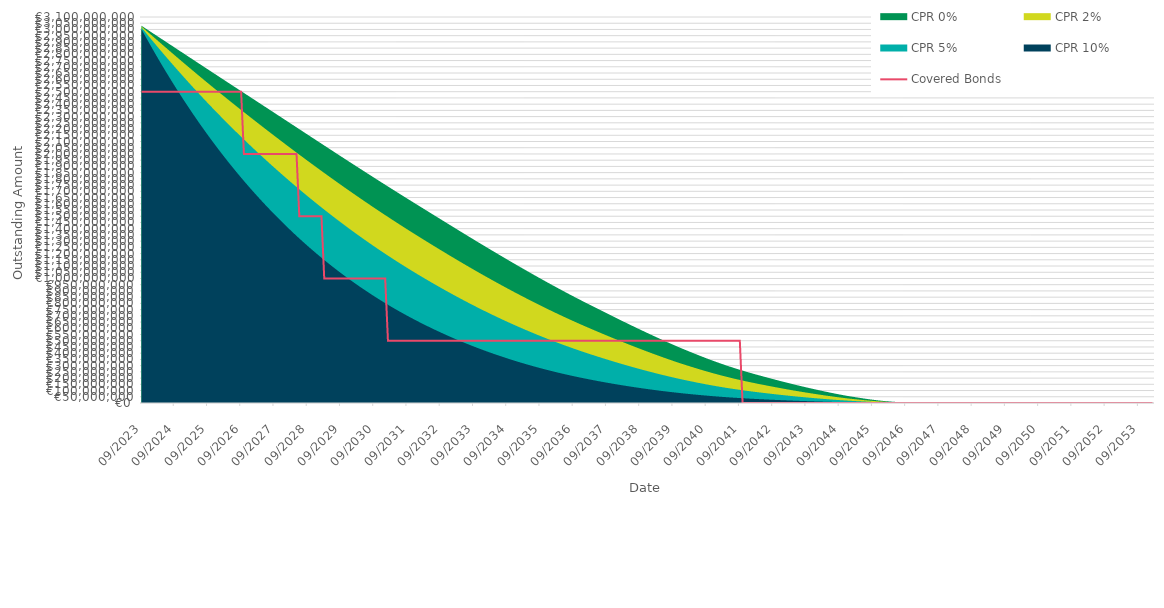
| Category | Covered Bonds |
|---|---|
| 2023-09-30 | 2500000000 |
| 2023-10-31 | 2500000000 |
| 2023-11-30 | 2500000000 |
| 2023-12-31 | 2500000000 |
| 2024-01-31 | 2500000000 |
| 2024-02-29 | 2500000000 |
| 2024-03-31 | 2500000000 |
| 2024-04-30 | 2500000000 |
| 2024-05-31 | 2500000000 |
| 2024-06-30 | 2500000000 |
| 2024-07-31 | 2500000000 |
| 2024-08-31 | 2500000000 |
| 2024-09-30 | 2500000000 |
| 2024-10-31 | 2500000000 |
| 2024-11-30 | 2500000000 |
| 2024-12-31 | 2500000000 |
| 2025-01-31 | 2500000000 |
| 2025-02-28 | 2500000000 |
| 2025-03-31 | 2500000000 |
| 2025-04-30 | 2500000000 |
| 2025-05-31 | 2500000000 |
| 2025-06-30 | 2500000000 |
| 2025-07-31 | 2500000000 |
| 2025-08-31 | 2500000000 |
| 2025-09-30 | 2500000000 |
| 2025-10-31 | 2500000000 |
| 2025-11-30 | 2500000000 |
| 2025-12-31 | 2500000000 |
| 2026-01-31 | 2500000000 |
| 2026-02-28 | 2500000000 |
| 2026-03-31 | 2500000000 |
| 2026-04-30 | 2500000000 |
| 2026-05-31 | 2500000000 |
| 2026-06-30 | 2500000000 |
| 2026-07-31 | 2500000000 |
| 2026-08-31 | 2500000000 |
| 2026-09-30 | 2500000000 |
| 2026-10-31 | 2000000000 |
| 2026-11-30 | 2000000000 |
| 2026-12-31 | 2000000000 |
| 2027-01-31 | 2000000000 |
| 2027-02-28 | 2000000000 |
| 2027-03-31 | 2000000000 |
| 2027-04-30 | 2000000000 |
| 2027-05-31 | 2000000000 |
| 2027-06-30 | 2000000000 |
| 2027-07-31 | 2000000000 |
| 2027-08-31 | 2000000000 |
| 2027-09-30 | 2000000000 |
| 2027-10-31 | 2000000000 |
| 2027-11-30 | 2000000000 |
| 2027-12-31 | 2000000000 |
| 2028-01-31 | 2000000000 |
| 2028-02-29 | 2000000000 |
| 2028-03-31 | 2000000000 |
| 2028-04-30 | 2000000000 |
| 2028-05-31 | 2000000000 |
| 2028-06-30 | 1500000000 |
| 2028-07-31 | 1500000000 |
| 2028-08-31 | 1500000000 |
| 2028-09-30 | 1500000000 |
| 2028-10-31 | 1500000000 |
| 2028-11-30 | 1500000000 |
| 2028-12-31 | 1500000000 |
| 2029-01-31 | 1500000000 |
| 2029-02-28 | 1500000000 |
| 2029-03-31 | 1000000000 |
| 2029-04-30 | 1000000000 |
| 2029-05-31 | 1000000000 |
| 2029-06-30 | 1000000000 |
| 2029-07-31 | 1000000000 |
| 2029-08-31 | 1000000000 |
| 2029-09-30 | 1000000000 |
| 2029-10-31 | 1000000000 |
| 2029-11-30 | 1000000000 |
| 2029-12-31 | 1000000000 |
| 2030-01-31 | 1000000000 |
| 2030-02-28 | 1000000000 |
| 2030-03-31 | 1000000000 |
| 2030-04-30 | 1000000000 |
| 2030-05-31 | 1000000000 |
| 2030-06-30 | 1000000000 |
| 2030-07-31 | 1000000000 |
| 2030-08-31 | 1000000000 |
| 2030-09-30 | 1000000000 |
| 2030-10-31 | 1000000000 |
| 2030-11-30 | 1000000000 |
| 2030-12-31 | 1000000000 |
| 2031-01-31 | 1000000000 |
| 2031-02-28 | 500000000 |
| 2031-03-31 | 500000000 |
| 2031-04-30 | 500000000 |
| 2031-05-31 | 500000000 |
| 2031-06-30 | 500000000 |
| 2031-07-31 | 500000000 |
| 2031-08-31 | 500000000 |
| 2031-09-30 | 500000000 |
| 2031-10-31 | 500000000 |
| 2031-11-30 | 500000000 |
| 2031-12-31 | 500000000 |
| 2032-01-31 | 500000000 |
| 2032-02-29 | 500000000 |
| 2032-03-31 | 500000000 |
| 2032-04-30 | 500000000 |
| 2032-05-31 | 500000000 |
| 2032-06-30 | 500000000 |
| 2032-07-31 | 500000000 |
| 2032-08-31 | 500000000 |
| 2032-09-30 | 500000000 |
| 2032-10-31 | 500000000 |
| 2032-11-30 | 500000000 |
| 2032-12-31 | 500000000 |
| 2033-01-31 | 500000000 |
| 2033-02-28 | 500000000 |
| 2033-03-31 | 500000000 |
| 2033-04-30 | 500000000 |
| 2033-05-31 | 500000000 |
| 2033-06-30 | 500000000 |
| 2033-07-31 | 500000000 |
| 2033-08-31 | 500000000 |
| 2033-09-30 | 500000000 |
| 2033-10-31 | 500000000 |
| 2033-11-30 | 500000000 |
| 2033-12-31 | 500000000 |
| 2034-01-31 | 500000000 |
| 2034-02-28 | 500000000 |
| 2034-03-31 | 500000000 |
| 2034-04-30 | 500000000 |
| 2034-05-31 | 500000000 |
| 2034-06-30 | 500000000 |
| 2034-07-31 | 500000000 |
| 2034-08-31 | 500000000 |
| 2034-09-30 | 500000000 |
| 2034-10-31 | 500000000 |
| 2034-11-30 | 500000000 |
| 2034-12-31 | 500000000 |
| 2035-01-31 | 500000000 |
| 2035-02-28 | 500000000 |
| 2035-03-31 | 500000000 |
| 2035-04-30 | 500000000 |
| 2035-05-31 | 500000000 |
| 2035-06-30 | 500000000 |
| 2035-07-31 | 500000000 |
| 2035-08-31 | 500000000 |
| 2035-09-30 | 500000000 |
| 2035-10-31 | 500000000 |
| 2035-11-30 | 500000000 |
| 2035-12-31 | 500000000 |
| 2036-01-31 | 500000000 |
| 2036-02-29 | 500000000 |
| 2036-03-31 | 500000000 |
| 2036-04-30 | 500000000 |
| 2036-05-31 | 500000000 |
| 2036-06-30 | 500000000 |
| 2036-07-31 | 500000000 |
| 2036-08-31 | 500000000 |
| 2036-09-30 | 500000000 |
| 2036-10-31 | 500000000 |
| 2036-11-30 | 500000000 |
| 2036-12-31 | 500000000 |
| 2037-01-31 | 500000000 |
| 2037-02-28 | 500000000 |
| 2037-03-31 | 500000000 |
| 2037-04-30 | 500000000 |
| 2037-05-31 | 500000000 |
| 2037-06-30 | 500000000 |
| 2037-07-31 | 500000000 |
| 2037-08-31 | 500000000 |
| 2037-09-30 | 500000000 |
| 2037-10-31 | 500000000 |
| 2037-11-30 | 500000000 |
| 2037-12-31 | 500000000 |
| 2038-01-31 | 500000000 |
| 2038-02-28 | 500000000 |
| 2038-03-31 | 500000000 |
| 2038-04-30 | 500000000 |
| 2038-05-31 | 500000000 |
| 2038-06-30 | 500000000 |
| 2038-07-31 | 500000000 |
| 2038-08-31 | 500000000 |
| 2038-09-30 | 500000000 |
| 2038-10-31 | 500000000 |
| 2038-11-30 | 500000000 |
| 2038-12-31 | 500000000 |
| 2039-01-31 | 500000000 |
| 2039-02-28 | 500000000 |
| 2039-03-31 | 500000000 |
| 2039-04-30 | 500000000 |
| 2039-05-31 | 500000000 |
| 2039-06-30 | 500000000 |
| 2039-07-31 | 500000000 |
| 2039-08-31 | 500000000 |
| 2039-09-30 | 500000000 |
| 2039-10-31 | 500000000 |
| 2039-11-30 | 500000000 |
| 2039-12-31 | 500000000 |
| 2040-01-31 | 500000000 |
| 2040-02-29 | 500000000 |
| 2040-03-31 | 500000000 |
| 2040-04-30 | 500000000 |
| 2040-05-31 | 500000000 |
| 2040-06-30 | 500000000 |
| 2040-07-31 | 500000000 |
| 2040-08-31 | 500000000 |
| 2040-09-30 | 500000000 |
| 2040-10-31 | 500000000 |
| 2040-11-30 | 500000000 |
| 2040-12-31 | 500000000 |
| 2041-01-31 | 500000000 |
| 2041-02-28 | 500000000 |
| 2041-03-31 | 500000000 |
| 2041-04-30 | 500000000 |
| 2041-05-31 | 500000000 |
| 2041-06-30 | 500000000 |
| 2041-07-31 | 500000000 |
| 2041-08-31 | 500000000 |
| 2041-09-30 | 500000000 |
| 2041-10-31 | 0 |
| 2041-11-30 | 0 |
| 2041-12-31 | 0 |
| 2042-01-31 | 0 |
| 2042-02-28 | 0 |
| 2042-03-31 | 0 |
| 2042-04-30 | 0 |
| 2042-05-31 | 0 |
| 2042-06-30 | 0 |
| 2042-07-31 | 0 |
| 2042-08-31 | 0 |
| 2042-09-30 | 0 |
| 2042-10-31 | 0 |
| 2042-11-30 | 0 |
| 2042-12-31 | 0 |
| 2043-01-31 | 0 |
| 2043-02-28 | 0 |
| 2043-03-31 | 0 |
| 2043-04-30 | 0 |
| 2043-05-31 | 0 |
| 2043-06-30 | 0 |
| 2043-07-31 | 0 |
| 2043-08-31 | 0 |
| 2043-09-30 | 0 |
| 2043-10-31 | 0 |
| 2043-11-30 | 0 |
| 2043-12-31 | 0 |
| 2044-01-31 | 0 |
| 2044-02-29 | 0 |
| 2044-03-31 | 0 |
| 2044-04-30 | 0 |
| 2044-05-31 | 0 |
| 2044-06-30 | 0 |
| 2044-07-31 | 0 |
| 2044-08-31 | 0 |
| 2044-09-30 | 0 |
| 2044-10-31 | 0 |
| 2044-11-30 | 0 |
| 2044-12-31 | 0 |
| 2045-01-31 | 0 |
| 2045-02-28 | 0 |
| 2045-03-31 | 0 |
| 2045-04-30 | 0 |
| 2045-05-31 | 0 |
| 2045-06-30 | 0 |
| 2045-07-31 | 0 |
| 2045-08-31 | 0 |
| 2045-09-30 | 0 |
| 2045-10-31 | 0 |
| 2045-11-30 | 0 |
| 2045-12-31 | 0 |
| 2046-01-31 | 0 |
| 2046-02-28 | 0 |
| 2046-03-31 | 0 |
| 2046-04-30 | 0 |
| 2046-05-31 | 0 |
| 2046-06-30 | 0 |
| 2046-07-31 | 0 |
| 2046-08-31 | 0 |
| 2046-09-30 | 0 |
| 2046-10-31 | 0 |
| 2046-11-30 | 0 |
| 2046-12-31 | 0 |
| 2047-01-31 | 0 |
| 2047-02-28 | 0 |
| 2047-03-31 | 0 |
| 2047-04-30 | 0 |
| 2047-05-31 | 0 |
| 2047-06-30 | 0 |
| 2047-07-31 | 0 |
| 2047-08-31 | 0 |
| 2047-09-30 | 0 |
| 2047-10-31 | 0 |
| 2047-11-30 | 0 |
| 2047-12-31 | 0 |
| 2048-01-31 | 0 |
| 2048-02-29 | 0 |
| 2048-03-31 | 0 |
| 2048-04-30 | 0 |
| 2048-05-31 | 0 |
| 2048-06-30 | 0 |
| 2048-07-31 | 0 |
| 2048-08-31 | 0 |
| 2048-09-30 | 0 |
| 2048-10-31 | 0 |
| 2048-11-30 | 0 |
| 2048-12-31 | 0 |
| 2049-01-31 | 0 |
| 2049-02-28 | 0 |
| 2049-03-31 | 0 |
| 2049-04-30 | 0 |
| 2049-05-31 | 0 |
| 2049-06-30 | 0 |
| 2049-07-31 | 0 |
| 2049-08-31 | 0 |
| 2049-09-30 | 0 |
| 2049-10-31 | 0 |
| 2049-11-30 | 0 |
| 2049-12-31 | 0 |
| 2050-01-31 | 0 |
| 2050-02-28 | 0 |
| 2050-03-31 | 0 |
| 2050-04-30 | 0 |
| 2050-05-31 | 0 |
| 2050-06-30 | 0 |
| 2050-07-31 | 0 |
| 2050-08-31 | 0 |
| 2050-09-30 | 0 |
| 2050-10-31 | 0 |
| 2050-11-30 | 0 |
| 2050-12-31 | 0 |
| 2051-01-31 | 0 |
| 2051-02-28 | 0 |
| 2051-03-31 | 0 |
| 2051-04-30 | 0 |
| 2051-05-31 | 0 |
| 2051-06-30 | 0 |
| 2051-07-31 | 0 |
| 2051-08-31 | 0 |
| 2051-09-30 | 0 |
| 2051-10-31 | 0 |
| 2051-11-30 | 0 |
| 2051-12-31 | 0 |
| 2052-01-31 | 0 |
| 2052-02-29 | 0 |
| 2052-03-31 | 0 |
| 2052-04-30 | 0 |
| 2052-05-31 | 0 |
| 2052-06-30 | 0 |
| 2052-07-31 | 0 |
| 2052-08-31 | 0 |
| 2052-09-30 | 0 |
| 2052-10-31 | 0 |
| 2052-11-30 | 0 |
| 2052-12-31 | 0 |
| 2053-01-31 | 0 |
| 2053-02-28 | 0 |
| 2053-03-31 | 0 |
| 2053-04-30 | 0 |
| 2053-05-31 | 0 |
| 2053-06-30 | 0 |
| 2053-07-31 | 0 |
| 2053-08-31 | 0 |
| 2053-09-30 | 0 |
| 2053-10-31 | 0 |
| 2053-11-30 | 0 |
| 2053-12-31 | 0 |
| 2054-01-31 | 0 |
| 2054-02-28 | 0 |